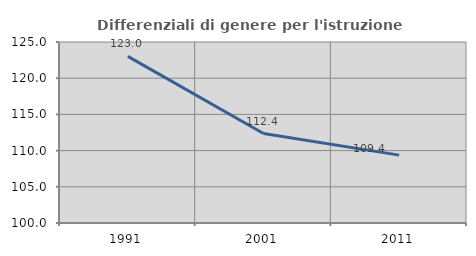
| Category | Differenziali di genere per l'istruzione superiore |
|---|---|
| 1991.0 | 123.01 |
| 2001.0 | 112.355 |
| 2011.0 | 109.374 |